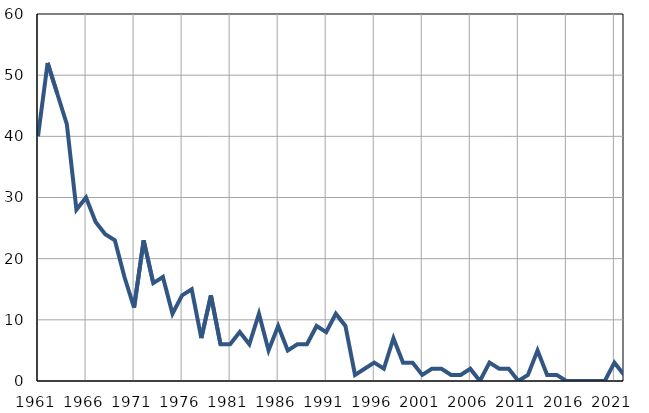
| Category | Infants
deaths |
|---|---|
| 1961.0 | 40 |
| 1962.0 | 52 |
| 1963.0 | 47 |
| 1964.0 | 42 |
| 1965.0 | 28 |
| 1966.0 | 30 |
| 1967.0 | 26 |
| 1968.0 | 24 |
| 1969.0 | 23 |
| 1970.0 | 17 |
| 1971.0 | 12 |
| 1972.0 | 23 |
| 1973.0 | 16 |
| 1974.0 | 17 |
| 1975.0 | 11 |
| 1976.0 | 14 |
| 1977.0 | 15 |
| 1978.0 | 7 |
| 1979.0 | 14 |
| 1980.0 | 6 |
| 1981.0 | 6 |
| 1982.0 | 8 |
| 1983.0 | 6 |
| 1984.0 | 11 |
| 1985.0 | 5 |
| 1986.0 | 9 |
| 1987.0 | 5 |
| 1988.0 | 6 |
| 1989.0 | 6 |
| 1990.0 | 9 |
| 1991.0 | 8 |
| 1992.0 | 11 |
| 1993.0 | 9 |
| 1994.0 | 1 |
| 1995.0 | 2 |
| 1996.0 | 3 |
| 1997.0 | 2 |
| 1998.0 | 7 |
| 1999.0 | 3 |
| 2000.0 | 3 |
| 2001.0 | 1 |
| 2002.0 | 2 |
| 2003.0 | 2 |
| 2004.0 | 1 |
| 2005.0 | 1 |
| 2006.0 | 2 |
| 2007.0 | 0 |
| 2008.0 | 3 |
| 2009.0 | 2 |
| 2010.0 | 2 |
| 2011.0 | 0 |
| 2012.0 | 1 |
| 2013.0 | 5 |
| 2014.0 | 1 |
| 2015.0 | 1 |
| 2016.0 | 0 |
| 2017.0 | 0 |
| 2018.0 | 0 |
| 2019.0 | 0 |
| 2020.0 | 0 |
| 2021.0 | 3 |
| 2022.0 | 1 |